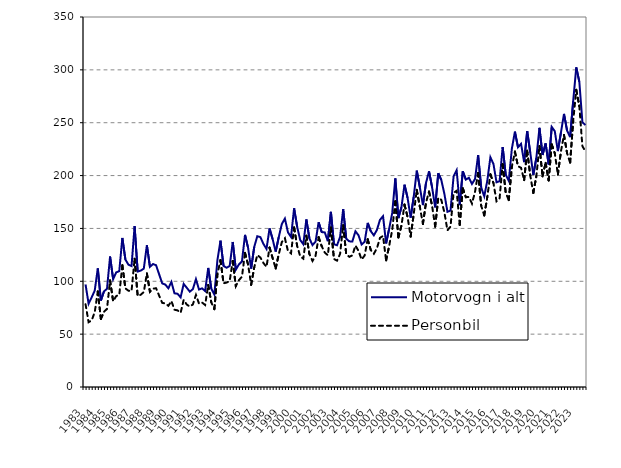
| Category | Motorvogn i alt | Personbil |
|---|---|---|
| 1983.0 | 97 | 78.3 |
| nan | 78.8 | 61.3 |
| nan | 84.8 | 63 |
| nan | 91.2 | 70.8 |
| 1984.0 | 112.2 | 90.4 |
| nan | 81.8 | 64.4 |
| nan | 90.4 | 71.1 |
| nan | 92.9 | 73.9 |
| 1985.0 | 123.4 | 100.8 |
| nan | 102 | 81.1 |
| nan | 108.4 | 86 |
| nan | 109.6 | 87.1 |
| 1986.0 | 141 | 115.2 |
| nan | 120.5 | 93.2 |
| nan | 115.7 | 91.1 |
| nan | 114.4 | 90.8 |
| 1987.0 | 152.2 | 121.3 |
| nan | 109.2 | 86.1 |
| nan | 110.1 | 87.3 |
| nan | 112 | 89.8 |
| 1988.0 | 134.1 | 107.5 |
| nan | 113.7 | 90 |
| nan | 116.3 | 93.1 |
| nan | 115.2 | 93.4 |
| 1989.0 | 106.6 | 86.4 |
| nan | 98 | 79.6 |
| nan | 96.9 | 79 |
| nan | 93.4 | 76.8 |
| 1990.0 | 99.4 | 81.3 |
| nan | 88.6 | 73.1 |
| nan | 88.2 | 72.5 |
| nan | 84.8 | 70.2 |
| 1991.0 | 97.5 | 82.4 |
| nan | 93.9 | 78 |
| nan | 90.2 | 76.1 |
| nan | 92.6 | 78.1 |
| 1992.0 | 102 | 87.1 |
| nan | 92.2 | 78.9 |
| nan | 93.3 | 79.9 |
| nan | 90.8 | 77.6 |
| 1993.0 | 112.6 | 96.5 |
| nan | 93 | 80.1 |
| nan | 87.5 | 73.6 |
| nan | 120.1 | 106.6 |
| 1994.0 | 138.4 | 120 |
| nan | 114.5 | 98.1 |
| nan | 112.8 | 98.8 |
| nan | 114.5 | 100.2 |
| 1995.0 | 137.2 | 119.3 |
| nan | 111 | 95.4 |
| nan | 115.9 | 101 |
| nan | 118.8 | 104.4 |
| 1996.0 | 143.9 | 126.9 |
| nan | 131.6 | 115.7 |
| nan | 112 | 96.7 |
| nan | 132.5 | 113.1 |
| 1997.0 | 142.6 | 124.8 |
| nan | 141.8 | 122.5 |
| nan | 135.4 | 117.3 |
| nan | 130.6 | 113.7 |
| 1998.0 | 150 | 131.9 |
| nan | 139.8 | 122 |
| nan | 128.1 | 112.1 |
| nan | 141.8 | 125.6 |
| 1999.0 | 154.2 | 137.1 |
| nan | 159.3 | 140.7 |
| nan | 146.3 | 128.7 |
| nan | 141.9 | 126.4 |
| 2000.0 | 169.1 | 150.9 |
| nan | 151.5 | 133.4 |
| nan | 139 | 123.5 |
| nan | 135.1 | 121.4 |
| 2001.0 | 158.5 | 143.1 |
| nan | 140.46 | 125.7 |
| nan | 134.24 | 119.2 |
| nan | 137.495 | 124.072 |
| 2002.0 | 155.814 | 141.724 |
| nan | 146.543 | 133.19 |
| nan | 146.231 | 127.141 |
| nan | 137.967 | 124.641 |
| 2003.0 | 165.679 | 150.811 |
| nan | 135.021 | 121.101 |
| nan | 134.111 | 119.491 |
| nan | 142.013 | 125.959 |
| 2004.0 | 168.309 | 153.043 |
| nan | 140.267 | 125.568 |
| nan | 137.77 | 123.121 |
| nan | 137.685 | 124.506 |
| 2005.0 | 147.311 | 133.756 |
| nan | 143.517 | 128.79 |
| nan | 134.783 | 120.571 |
| nan | 137.37 | 124.382 |
| 2006.0 | 155.213 | 139.728 |
| nan | 147.444 | 129.572 |
| nan | 143.451 | 126.006 |
| nan | 148.561 | 131.195 |
| 2007.0 | 158.1 | 141.084 |
| nan | 161.613 | 142.897 |
| nan | 135.821 | 119.753 |
| nan | 149.791 | 133.498 |
| 2008.0 | 164.642 | 148.614 |
| nan | 197.287 | 175.714 |
| nan | 159.718 | 141.407 |
| nan | 170.057 | 152.54 |
| 2009.0 | 191.38 | 172.559 |
| nan | 178.906 | 160.765 |
| nan | 160.234 | 142.312 |
| nan | 179.857 | 163.532 |
| 2010.0 | 204.636 | 186.507 |
| nan | 188.957 | 170.463 |
| nan | 172.077 | 154.156 |
| nan | 192.961 | 174.399 |
| 2011.0 | 204.005 | 184.86 |
| nan | 188.741 | 171.333 |
| nan | 169.934 | 151.694 |
| nan | 202.176 | 178.919 |
| 2012.0 | 195.829 | 177.072 |
| nan | 182.751 | 165.128 |
| nan | 165.73 | 148.242 |
| nan | 166.805 | 151.728 |
| 2013.0 | 199.181 | 183.653 |
| nan | 205.015 | 185.634 |
| nan | 172.044 | 153.21 |
| nan | 204.1 | 188.079 |
| 2014.0 | 196.177 | 179.552 |
| nan | 197.965 | 179.767 |
| nan | 192.105 | 173.474 |
| nan | 196.809 | 184.739 |
| 2015.0 | 219.419 | 202.592 |
| nan | 188.696 | 171.451 |
| nan | 180.388 | 162.297 |
| nan | 195.23 | 179.891 |
| 2016.0 | 217.298 | 201.197 |
| nan | 210.949 | 192.893 |
| nan | 193.648 | 175.642 |
| nan | 194.663 | 178.455 |
| 2017.0 | 227.029 | 210.738 |
| nan | 200.767 | 183.708 |
| nan | 195.059 | 176.766 |
| nan | 225.423 | 208.218 |
| 2018.0 | 241.528 | 222.678 |
| nan | 226.771 | 208.839 |
| nan | 230.044 | 207.395 |
| nan | 212.667 | 195.666 |
| 2019.0 | 242.056 | 223.584 |
| nan | 221.711 | 199.972 |
| nan | 200.668 | 183.518 |
| nan | 216.92 | 199.72 |
| 2020.0 | 245.163 | 227.947 |
| nan | 219.434 | 199.239 |
| nan | 230.409 | 212.039 |
| nan | 210.538 | 195.423 |
| 2021.0 | 246.037 | 229.482 |
| nan | 241.941 | 221.096 |
| nan | 223.162 | 200.95 |
| nan | 240.674 | 222.834 |
| 2022.0 | 258.319 | 238.379 |
| nan | 242.592 | 221.267 |
| nan | 236.373 | 212.275 |
| nan | 270.368 | 251.769 |
| 2023.0 | 302.388 | 281.084 |
| nan | 288.712 | 265.488 |
| nan | 250.488 | 227.832 |
| nan | 247.764 | 222.814 |